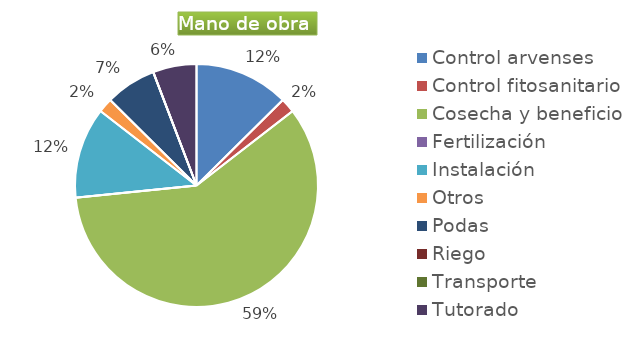
| Category | Series 0 |
|---|---|
| Control arvenses | 1915784 |
| Control fitosanitario | 294736 |
| Cosecha y beneficio | 8970000 |
| Fertilización | 0 |
| Instalación | 1842100 |
| Otros | 294736 |
| Podas | 1031576 |
| Riego | 0 |
| Transporte | 0 |
| Tutorado | 884208 |